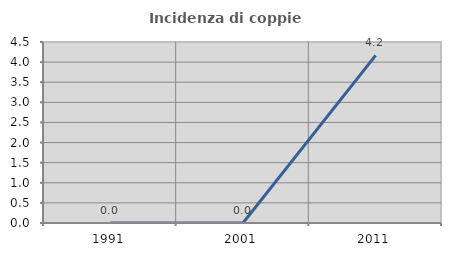
| Category | Incidenza di coppie miste |
|---|---|
| 1991.0 | 0 |
| 2001.0 | 0 |
| 2011.0 | 4.167 |